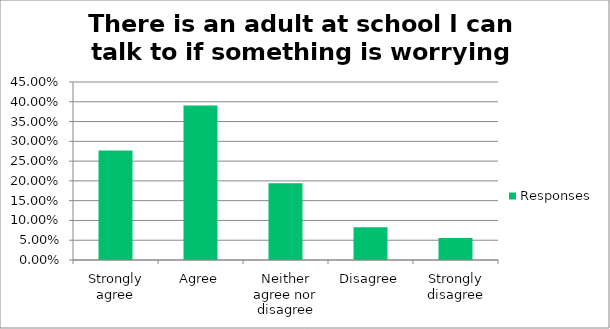
| Category | Responses |
|---|---|
| Strongly agree | 0.277 |
| Agree | 0.39 |
| Neither agree nor disagree | 0.194 |
| Disagree | 0.083 |
| Strongly disagree | 0.056 |